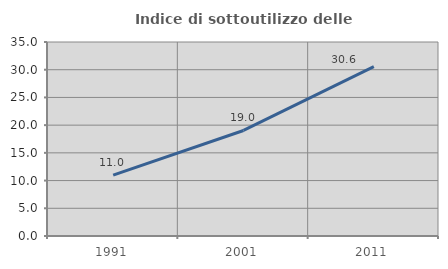
| Category | Indice di sottoutilizzo delle abitazioni  |
|---|---|
| 1991.0 | 10.993 |
| 2001.0 | 19.039 |
| 2011.0 | 30.57 |